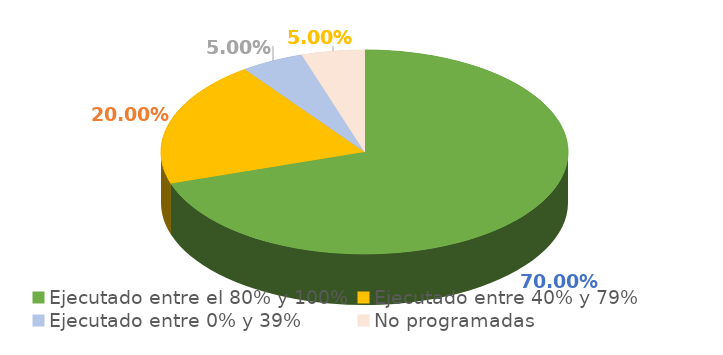
| Category | Series 0 |
|---|---|
| Ejecutado entre el 80% y 100% | 0.7 |
| Ejecutado entre 40% y 79% | 0.2 |
| Ejecutado entre 0% y 39% | 0.05 |
| No programadas | 0.05 |